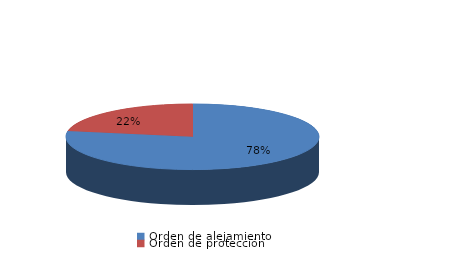
| Category | Series 0 |
|---|---|
| Orden de alejamiento | 21 |
| Orden de protección | 6 |